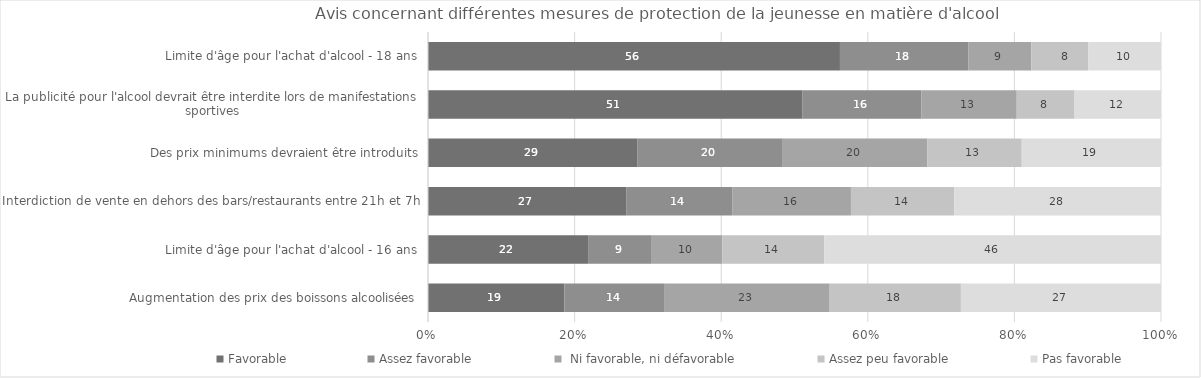
| Category | Favorable | Assez favorable |  Ni favorable, ni défavorable | Assez peu favorable | Pas favorable |
|---|---|---|---|---|---|
| Limite d'âge pour l'achat d'alcool - 18 ans | 56.2 | 17.5 | 8.6 | 7.8 | 9.9 |
| La publicité pour l'alcool devrait être interdite lors de manifestations sportives | 51.1 | 16.3 | 13 | 7.9 | 11.8 |
| Des prix minimums devraient être introduits | 28.6 | 19.8 | 19.7 | 12.9 | 19 |
| Interdiction de vente en dehors des bars/restaurants entre 21h et 7h | 27.1 | 14.4 | 16.2 | 14.1 | 28.2 |
| Limite d'âge pour l'achat d'alcool - 16 ans | 21.9 | 8.6 | 9.6 | 13.9 | 45.9 |
| Augmentation des prix des boissons alcoolisées | 18.6 | 13.7 | 22.5 | 17.9 | 27.3 |